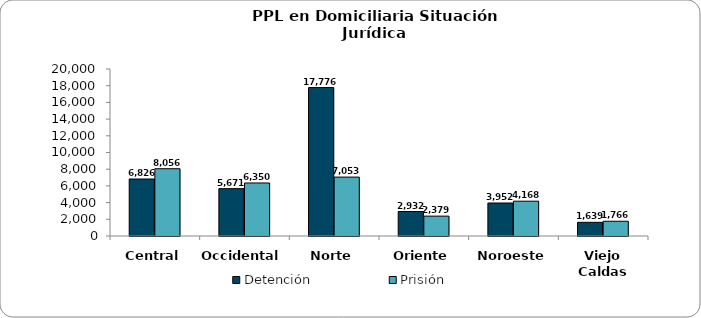
| Category | Detención | Prisión |
|---|---|---|
| Central | 6826 | 8056 |
| Occidental | 5671 | 6350 |
| Norte | 17776 | 7053 |
| Oriente | 2932 | 2379 |
| Noroeste | 3952 | 4168 |
| Viejo Caldas | 1639 | 1766 |